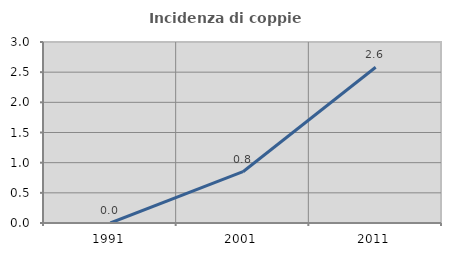
| Category | Incidenza di coppie miste |
|---|---|
| 1991.0 | 0 |
| 2001.0 | 0.85 |
| 2011.0 | 2.581 |